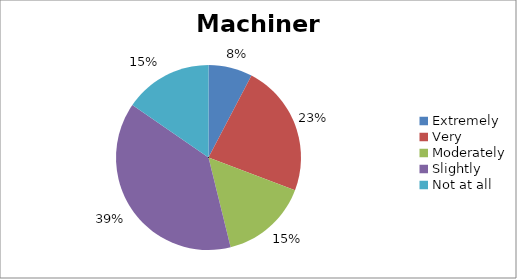
| Category | Machinery |
|---|---|
| Extremely | 1 |
| Very | 3 |
| Moderately | 2 |
| Slightly | 5 |
| Not at all | 2 |